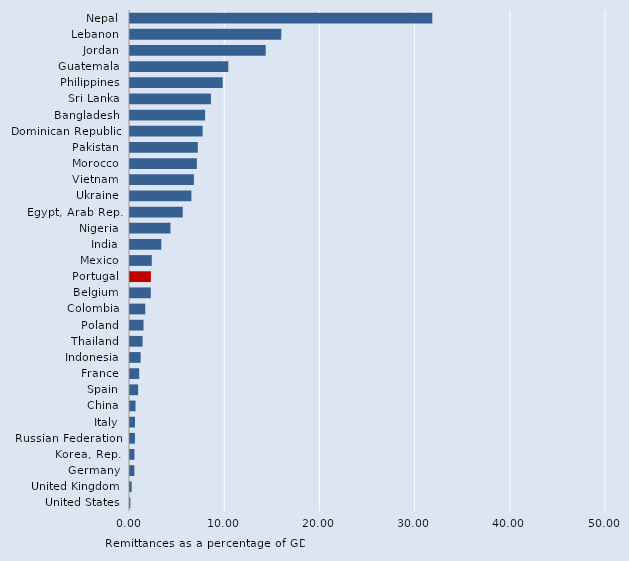
| Category | Series 0 |
|---|---|
| Nepal | 31.753 |
| Lebanon | 15.888 |
| Jordan | 14.256 |
| Guatemala | 10.326 |
| Philippines | 9.739 |
| Sri Lanka | 8.503 |
| Bangladesh | 7.888 |
| Dominican Republic | 7.63 |
| Pakistan | 7.123 |
| Morocco | 7.025 |
| Vietnam | 6.715 |
| Ukraine | 6.45 |
| Egypt, Arab Rep. | 5.54 |
| Nigeria | 4.253 |
| India | 3.289 |
| Mexico | 2.288 |
| Portugal | 2.196 |
| Belgium | 2.183 |
| Colombia | 1.6 |
| Poland | 1.422 |
| Thailand | 1.32 |
| Indonesia | 1.117 |
| France | 0.965 |
| Spain | 0.857 |
| China | 0.581 |
| Italy | 0.522 |
| Russian Federation | 0.516 |
| Korea, Rep. | 0.468 |
| Germany | 0.457 |
| United Kingdom | 0.175 |
| United States | 0.039 |